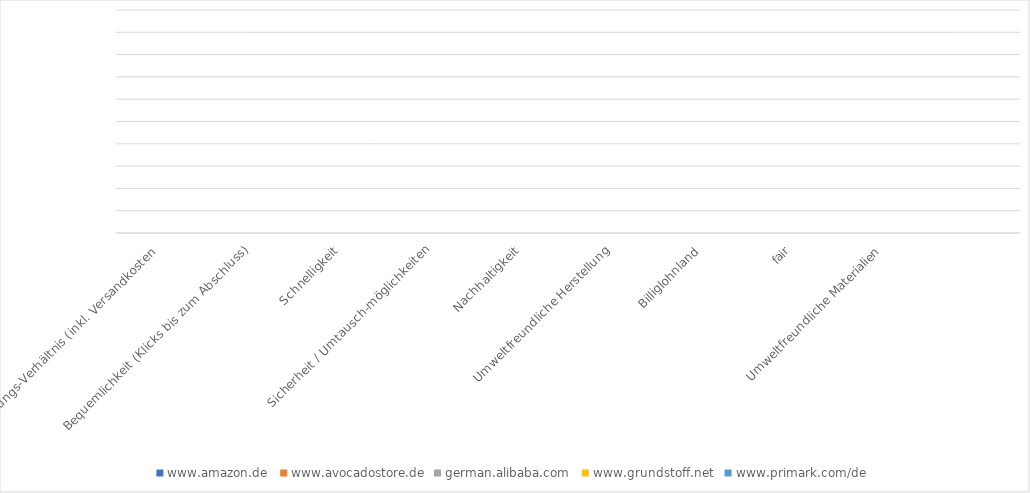
| Category | www.amazon.de  | www.avocadostore.de | german.alibaba.com  | www.grundstoff.net  | www.primark.com/de  |
|---|---|---|---|---|---|
| Preis-Leistungs-Verhältnis (inkl. Versandkosten | 0 | 0 | 0 | 0 | 0 |
| Bequemlichkeit (Klicks bis zum Abschluss) | 0 | 0 | 0 | 0 | 0 |
| Schnelligkeit | 0 | 0 | 0 | 0 | 0 |
| Sicherheit / Umtausch-möglichkeiten | 0 | 0 | 0 | 0 | 0 |
| Nachhaltigkeit | 0 | 0 | 0 | 0 | 0 |
| Umweltfreundliche Herstellung | 0 | 0 | 0 | 0 | 0 |
| Billiglohnland | 0 | 0 | 0 | 0 | 0 |
| fair | 0 | 0 | 0 | 0 | 0 |
| Umweltfreundliche Materialien | 0 | 0 | 0 | 0 | 0 |